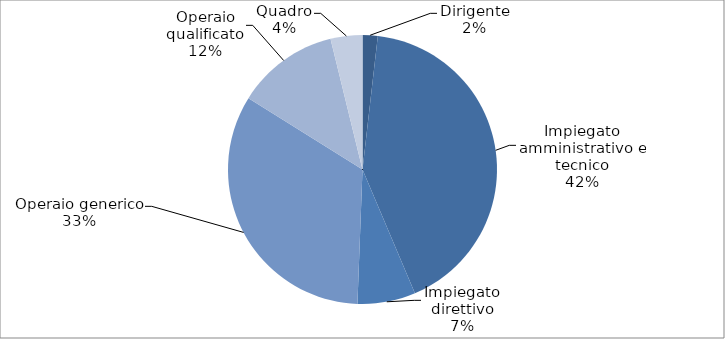
| Category | Series 0 |
|---|---|
| Dirigente | 1.796 |
| Impiegato amministrativo e tecnico | 41.315 |
| Impiegato direttivo | 6.891 |
| Operaio generico | 32.905 |
| Operaio qualificato | 12.131 |
| Quadro | 3.779 |